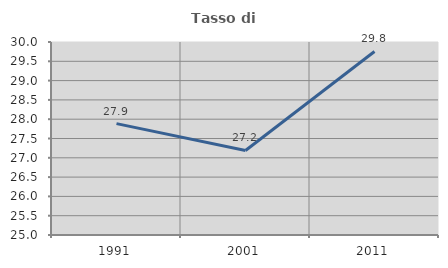
| Category | Tasso di occupazione   |
|---|---|
| 1991.0 | 27.885 |
| 2001.0 | 27.19 |
| 2011.0 | 29.755 |